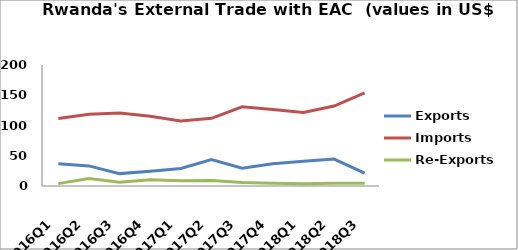
| Category | Exports | Imports | Re-Exports |
|---|---|---|---|
| 2016Q1 | 36.703 | 111.68 | 3.904 |
| 2016Q2 | 33.197 | 118.463 | 12.441 |
| 2016Q3 | 20.47 | 120.843 | 6.13 |
| 2016Q4 | 24.212 | 115.168 | 10.336 |
| 2017Q1 | 28.948 | 107.584 | 8.693 |
| 2017Q2 | 43.559 | 111.838 | 9.044 |
| 2017Q3 | 29.262 | 130.823 | 5.955 |
| 2017Q4 | 36.925 | 126.387 | 4.74 |
| 2018Q1 | 40.765 | 121.477 | 3.856 |
| 2018Q2 | 44.545 | 132.214 | 4.622 |
| 2018Q3 | 21.112 | 153.75 | 4.72 |